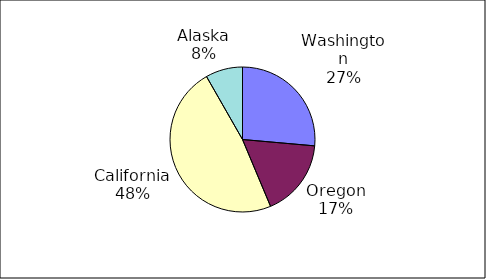
| Category | Series 0 |
|---|---|
| Washington | 27350 |
| Oregon | 17892 |
| California | 49781 |
| Alaska | 8563 |